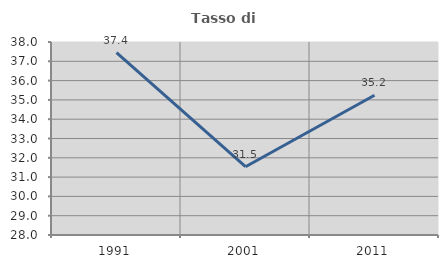
| Category | Tasso di occupazione   |
|---|---|
| 1991.0 | 37.445 |
| 2001.0 | 31.537 |
| 2011.0 | 35.239 |